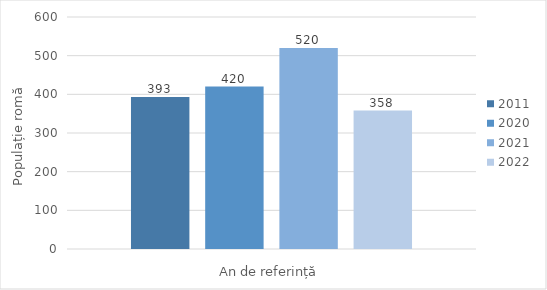
| Category | 2011 | 2020 | 2021 | 2022 |
|---|---|---|---|---|
| 358.0 | 393 | 420 | 520 | 358 |